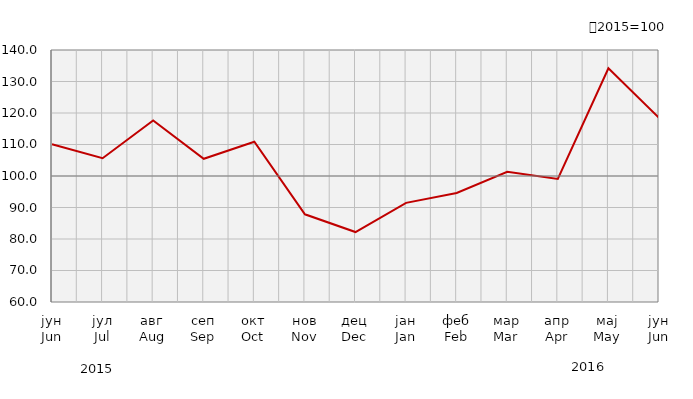
| Category | Индекси ноћења туриста
Tourist night indices |
|---|---|
| јун
Jun | 110.099 |
| јул
Jul | 105.635 |
| авг
Aug | 117.617 |
| сеп
Sep | 105.466 |
| окт
Oct | 110.883 |
| нов
Nov | 87.836 |
| дец
Dec | 82.203 |
| јан
Jan | 91.47 |
| феб
Feb | 94.599 |
| мар
Mar | 101.315 |
| апр
Apr | 99.062 |
| мај
May | 134.186 |
| јун
Jun | 118.44 |